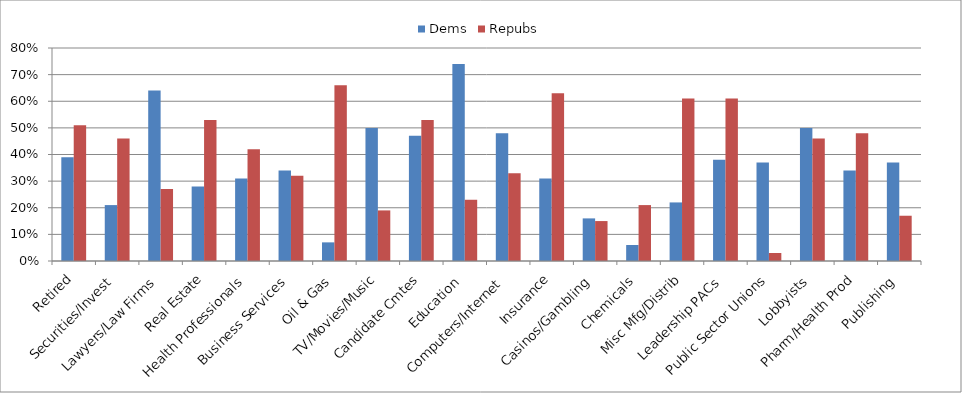
| Category | Dems | Repubs |
|---|---|---|
| Retired | 0.39 | 0.51 |
| Securities/Invest | 0.21 | 0.46 |
| Lawyers/Law Firms | 0.64 | 0.27 |
| Real Estate | 0.28 | 0.53 |
| Health Professionals | 0.31 | 0.42 |
| Business Services | 0.34 | 0.32 |
| Oil & Gas | 0.07 | 0.66 |
| TV/Movies/Music | 0.5 | 0.19 |
| Candidate Cmtes | 0.47 | 0.53 |
| Education | 0.74 | 0.23 |
| Computers/Internet | 0.48 | 0.33 |
| Insurance | 0.31 | 0.63 |
| Casinos/Gambling | 0.16 | 0.15 |
| Chemicals | 0.06 | 0.21 |
| Misc Mfg/Distrib | 0.22 | 0.61 |
| Leadership PACs | 0.38 | 0.61 |
| Public Sector Unions | 0.37 | 0.03 |
| Lobbyists | 0.5 | 0.46 |
| Pharm/Health Prod | 0.34 | 0.48 |
| Publishing | 0.37 | 0.17 |